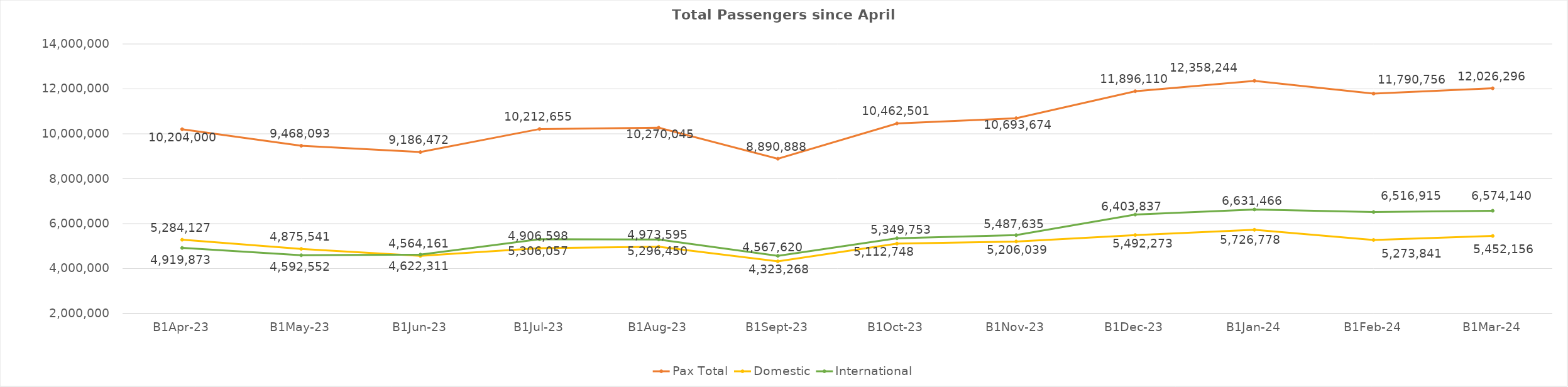
| Category | Pax Total | Domestic | International |
|---|---|---|---|
| 2023-04-01 | 10204000 | 5284127 | 4919873 |
| 2023-05-01 | 9468093 | 4875541 | 4592552 |
| 2023-06-01 | 9186472 | 4564161 | 4622311 |
| 2023-07-01 | 10212655 | 4906598 | 5306057 |
| 2023-08-01 | 10270045 | 4973595 | 5296450 |
| 2023-09-01 | 8890888 | 4323268 | 4567620 |
| 2023-10-01 | 10462501 | 5112748 | 5349753 |
| 2023-11-01 | 10693674 | 5206039 | 5487635 |
| 2023-12-01 | 11896110 | 5492273 | 6403837 |
| 2024-01-01 | 12358244 | 5726778 | 6631466 |
| 2024-02-01 | 11790756 | 5273841 | 6516915 |
| 2024-03-01 | 12026296 | 5452156 | 6574140 |